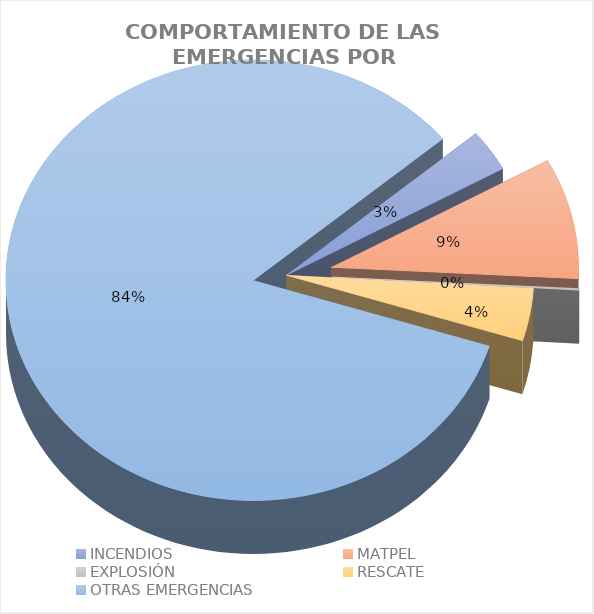
| Category | Incidentes |
|---|---|
| INCENDIOS | 0.031 |
| MATPEL | 0.089 |
| EXPLOSIÓN | 0.001 |
| RESCATE | 0.039 |
| OTRAS EMERGENCIAS | 0.841 |